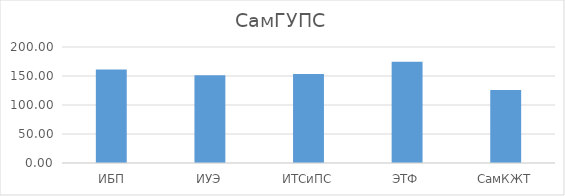
| Category | Series 0 |
|---|---|
|  ИБП | 161.306 |
| ИУЭ | 151.208 |
| ИТСиПС | 153.45 |
| ЭТФ | 174.455 |
| СамКЖТ | 125.9 |